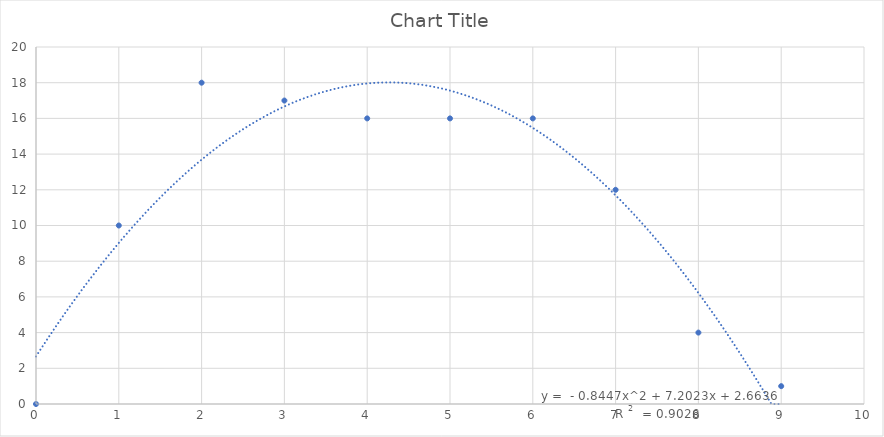
| Category | Series 0 |
|---|---|
| 0.0 | 0 |
| 1.0 | 10 |
| 2.0 | 18 |
| 3.0 | 17 |
| 4.0 | 16 |
| 5.0 | 16 |
| 6.0 | 16 |
| 7.0 | 12 |
| 8.0 | 4 |
| 9.0 | 1 |